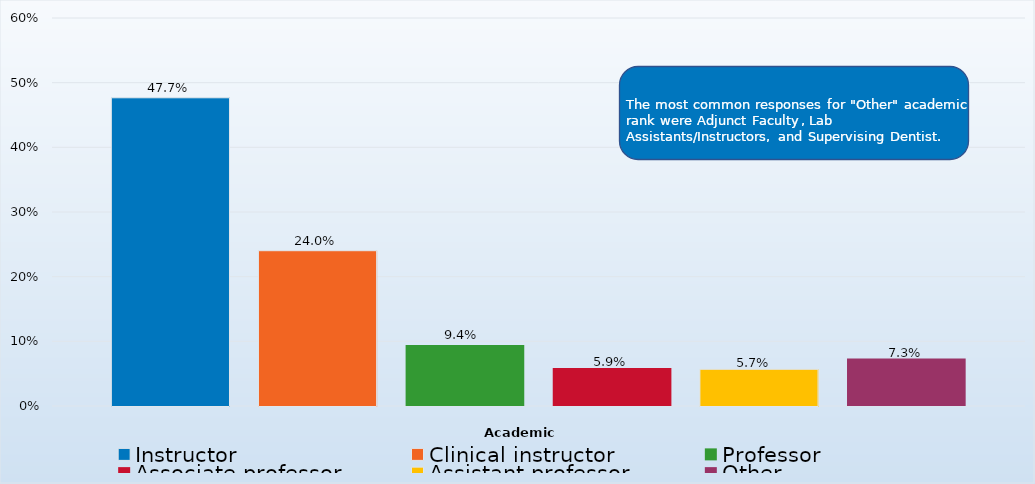
| Category | Instructor | Clinical instructor | Professor | Associate professor | Assistant professor | Other |
|---|---|---|---|---|---|---|
| 0 | 0.477 | 0.24 | 0.094 | 0.059 | 0.057 | 0.073 |